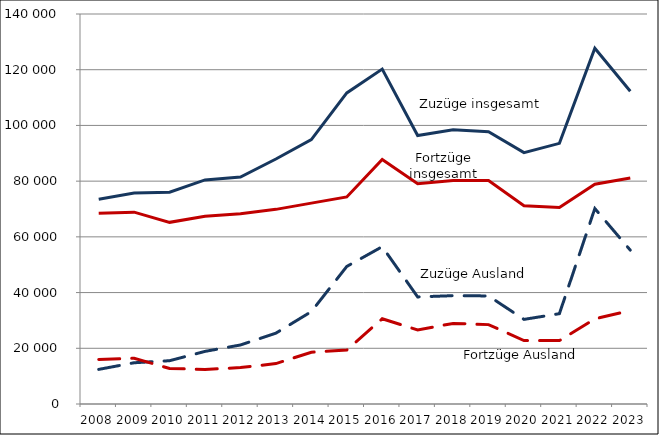
| Category | Zuzüge insgesamt | Zuzüge Ausland | Fortzüge insgesamt | Fortzüge Ausland |
|---|---|---|---|---|
| 2008.0 | 73493 | 12423 | 68439 | 15962 |
| 2009.0 | 75743 | 14806 | 68871 | 16413 |
| 2010.0 | 76032 | 15542 | 65209 | 12763 |
| 2011.0 | 80446 | 18887 | 67433 | 12401 |
| 2012.0 | 81472 | 21188 | 68334 | 13076 |
| 2013.0 | 87939 | 25439 | 69872 | 14506 |
| 2014.0 | 94900 | 33167 | 72104 | 18593 |
| 2015.0 | 111661 | 49379 | 74317 | 19376 |
| 2016.0 | 120235 | 56476 | 87754 | 30599 |
| 2017.0 | 96375 | 38438 | 79097 | 26566 |
| 2018.0 | 98424 | 38891 | 80217 | 28929 |
| 2019.0 | 97716 | 38791 | 80195 | 28497 |
| 2020.0 | 90243 | 30375 | 71178 | 22794 |
| 2021.0 | 93568 | 32423 | 70554 | 22771 |
| 2022.0 | 127720 | 70168 | 78895 | 30552 |
| 2023.0 | 112269 | 55231 | 81125 | 33573 |